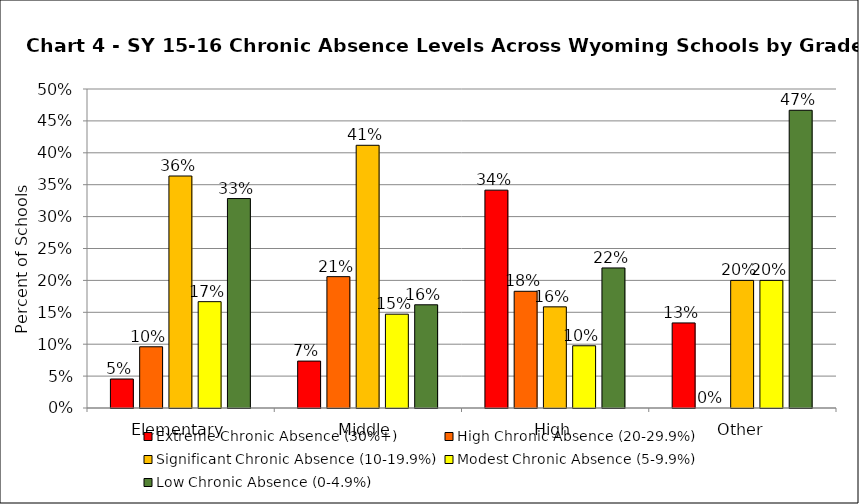
| Category | Extreme Chronic Absence (30%+) | High Chronic Absence (20-29.9%) | Significant Chronic Absence (10-19.9%) | Modest Chronic Absence (5-9.9%) | Low Chronic Absence (0-4.9%) |
|---|---|---|---|---|---|
| 0 | 0.045 | 0.096 | 0.364 | 0.167 | 0.328 |
| 1 | 0.074 | 0.206 | 0.412 | 0.147 | 0.162 |
| 2 | 0.341 | 0.183 | 0.159 | 0.098 | 0.22 |
| 3 | 0.133 | 0 | 0.2 | 0.2 | 0.467 |